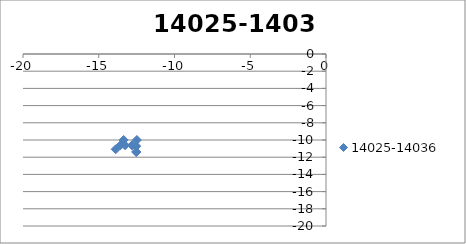
| Category | 14025-14036 |
|---|---|
| -12.482802164762475 | -9.998 |
| -13.357155742633793 | -9.998 |
| -12.52306073361395 | -10.722 |
| -13.571767889356584 | -10.617 |
| -12.797414311485266 | -10.617 |
| -12.797414311485266 | -10.617 |
| -13.262026458208059 | -10.617 |
| -13.881509320505115 | -11.082 |
| -12.52306073361395 | -11.392 |
| -12.52306073361395 | -11.392 |